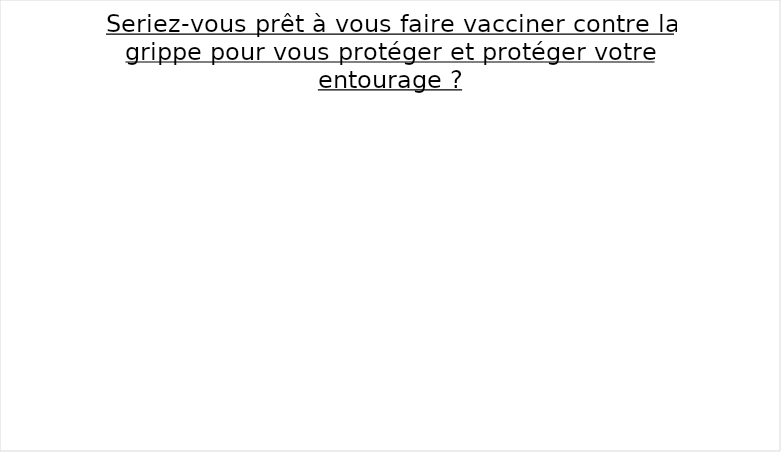
| Category | Series 0 |
|---|---|
| Oui | 0 |
| Non | 0 |
| Je me suis déjà vacciné-e cette année | 0 |